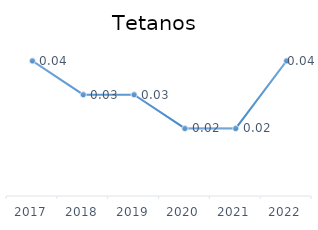
| Category | Series 0 |
|---|---|
| 2017.0 | 0.04 |
| 2018.0 | 0.03 |
| 2019.0 | 0.03 |
| 2020.0 | 0.02 |
| 2021.0 | 0.02 |
| 2022.0 | 0.04 |